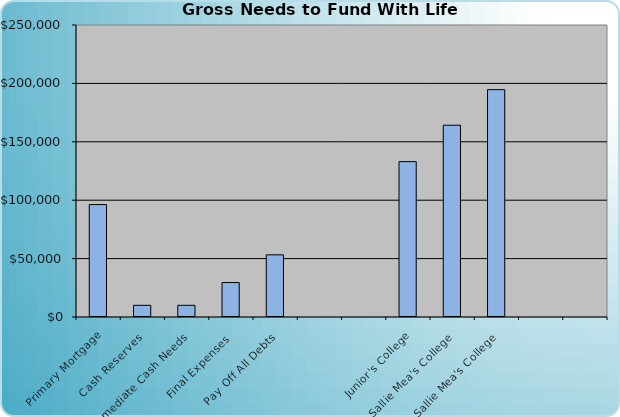
| Category | Series 0 |
|---|---|
| Primary Mortgage | 96247.428 |
| Cash Reserves | 10000 |
| Immediate Cash Needs | 10000 |
| Final Expenses | 29500 |
| Pay Off All Debts | 53228.929 |
|   | 0 |
|   | 0 |
| Junior's College | 133034.748 |
| Sallie Mea's College | 164173.041 |
| Sallie Mea's College | 194634.575 |
|   | 0 |
|   | 0 |